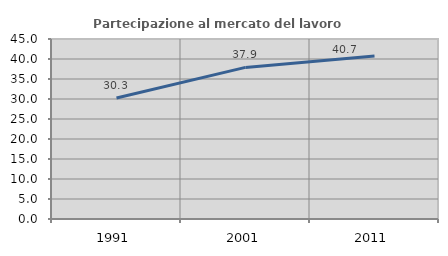
| Category | Partecipazione al mercato del lavoro  femminile |
|---|---|
| 1991.0 | 30.269 |
| 2001.0 | 37.902 |
| 2011.0 | 40.734 |